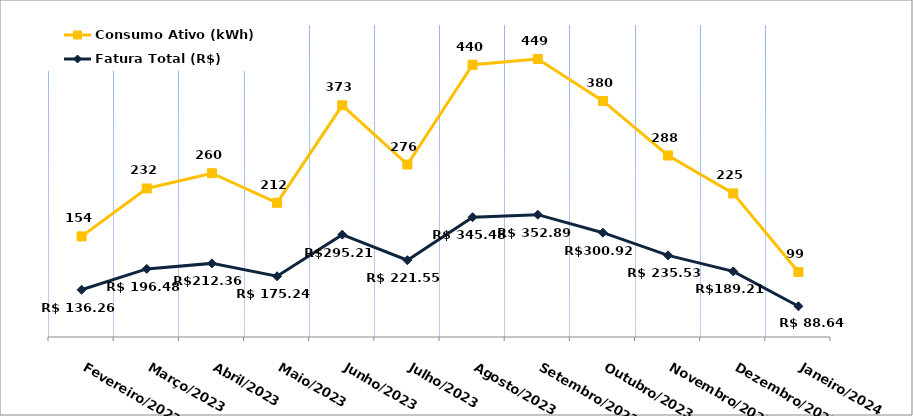
| Category | Fatura Total (R$) | Consumo Ativo (kWh) |
|---|---|---|
| Fevereiro/2023 | 136.26 | 154 |
| Março/2023 | 196.48 | 232 |
| Abril/2023 | 212.36 | 260 |
| Maio/2023 | 175.24 | 212 |
| Junho/2023 | 295.21 | 373 |
| Julho/2023 | 221.55 | 276 |
| Agosto/2023 | 345.48 | 440 |
| Setembro/2023 | 352.89 | 449 |
| Outubro/2023 | 300.92 | 380 |
| Novembro/2023 | 235.53 | 288 |
| Dezembro/2023 | 189.21 | 225 |
| Janeiro/2024 | 88.64 | 99 |